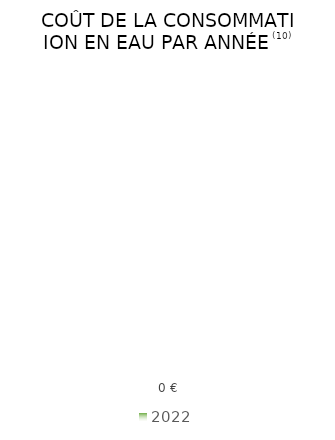
| Category | 2022 |
|---|---|
| Total | 0 |